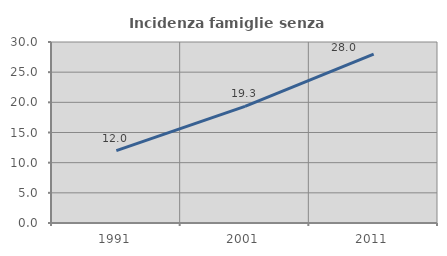
| Category | Incidenza famiglie senza nuclei |
|---|---|
| 1991.0 | 11.995 |
| 2001.0 | 19.33 |
| 2011.0 | 27.993 |